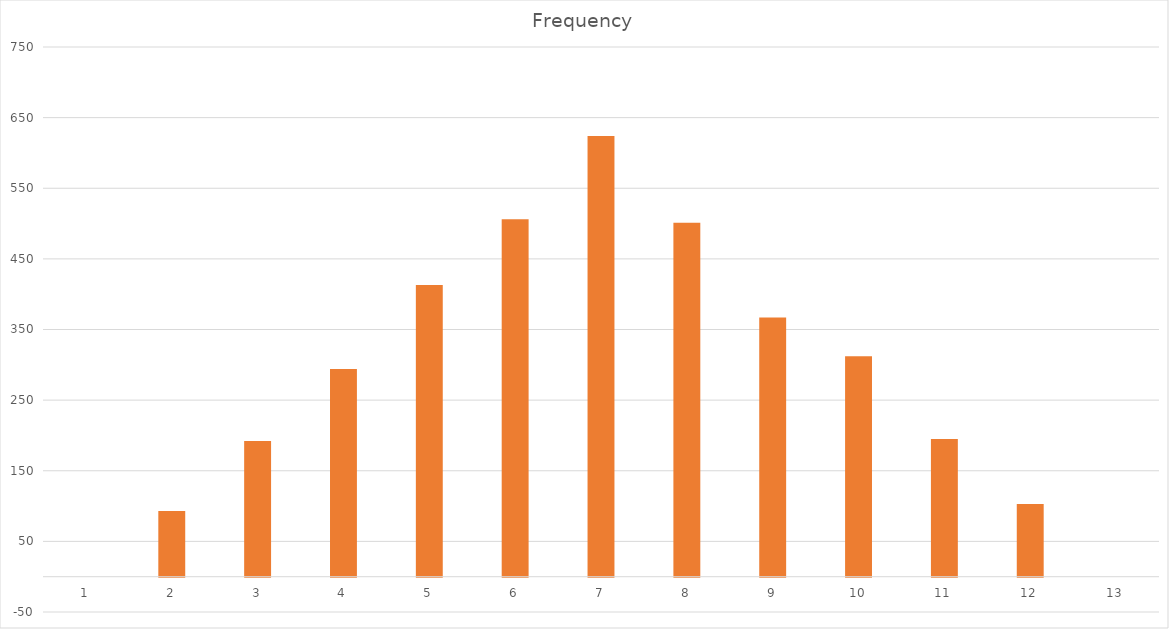
| Category | Frequency |
|---|---|
| 0 | 0 |
| 1 | 93 |
| 2 | 192 |
| 3 | 294 |
| 4 | 413 |
| 5 | 506 |
| 6 | 624 |
| 7 | 501 |
| 8 | 367 |
| 9 | 312 |
| 10 | 195 |
| 11 | 103 |
| 12 | 0 |